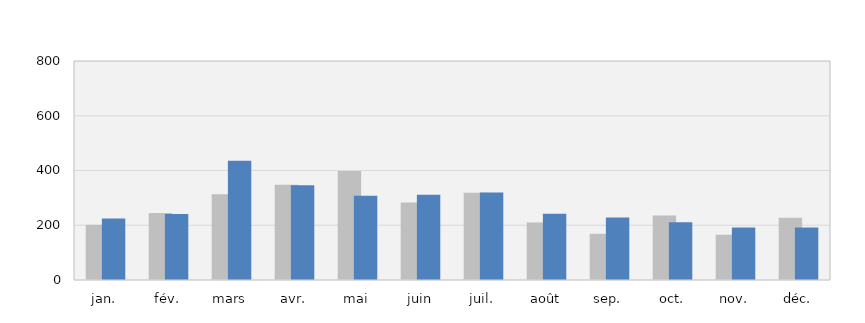
| Category | 2019 | 2020 |
|---|---|---|
| jan. | 202 | 225 |
| fév. | 245 | 241 |
| mars | 313 | 436 |
| avr. | 348 | 346 |
| mai | 398 | 308 |
| juin | 283 | 311 |
| juil. | 319 | 320 |
| août | 210 | 242 |
| sep. | 169 | 228 |
| oct. | 236 | 211 |
| nov. | 165 | 192 |
| déc. | 227 | 192 |